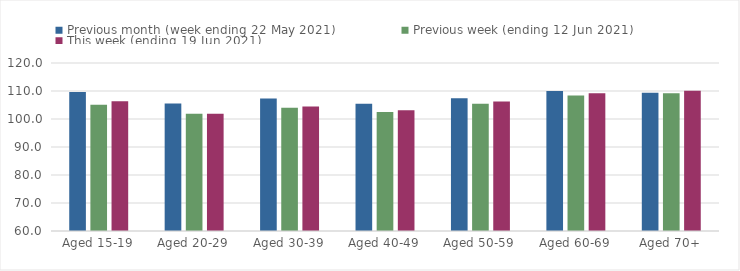
| Category | Previous month (week ending 22 May 2021) | Previous week (ending 12 Jun 2021) | This week (ending 19 Jun 2021) |
|---|---|---|---|
| Aged 15-19 | 109.67 | 105.13 | 106.31 |
| Aged 20-29 | 105.51 | 101.91 | 101.91 |
| Aged 30-39 | 107.32 | 104.06 | 104.44 |
| Aged 40-49 | 105.41 | 102.49 | 103.16 |
| Aged 50-59 | 107.44 | 105.49 | 106.23 |
| Aged 60-69 | 109.96 | 108.43 | 109.24 |
| Aged 70+ | 109.4 | 109.17 | 110.07 |